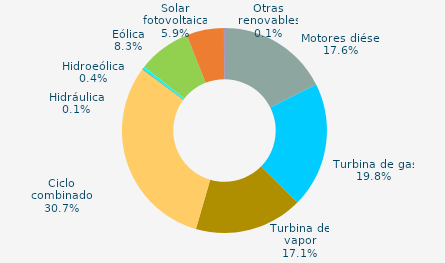
| Category | Series 0 |
|---|---|
| Motores diésel | 17.6 |
| Turbina de gas | 19.8 |
| Turbina de vapor | 17.1 |
| Ciclo combinado | 30.7 |
| Cogeneración | 0 |
| Hidráulica | 0.1 |
| Hidroeólica | 0.4 |
| Eólica | 8.3 |
| Solar fotovoltaica | 5.9 |
| Otras renovables | 0.1 |